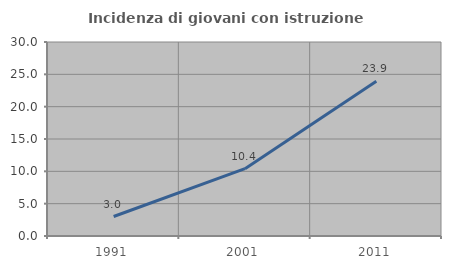
| Category | Incidenza di giovani con istruzione universitaria |
|---|---|
| 1991.0 | 3.014 |
| 2001.0 | 10.417 |
| 2011.0 | 23.923 |